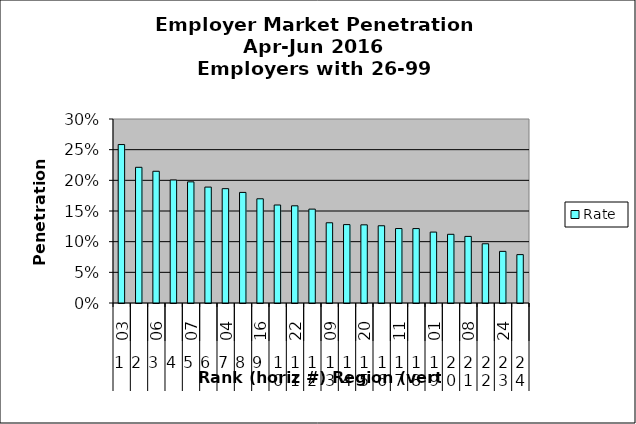
| Category | Rate |
|---|---|
| 0 | 0.258 |
| 1 | 0.221 |
| 2 | 0.215 |
| 3 | 0.201 |
| 4 | 0.198 |
| 5 | 0.189 |
| 6 | 0.186 |
| 7 | 0.18 |
| 8 | 0.17 |
| 9 | 0.16 |
| 10 | 0.158 |
| 11 | 0.153 |
| 12 | 0.131 |
| 13 | 0.128 |
| 14 | 0.127 |
| 15 | 0.126 |
| 16 | 0.121 |
| 17 | 0.121 |
| 18 | 0.116 |
| 19 | 0.112 |
| 20 | 0.109 |
| 21 | 0.097 |
| 22 | 0.084 |
| 23 | 0.079 |